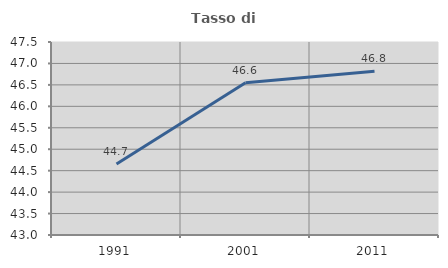
| Category | Tasso di occupazione   |
|---|---|
| 1991.0 | 44.657 |
| 2001.0 | 46.552 |
| 2011.0 | 46.815 |